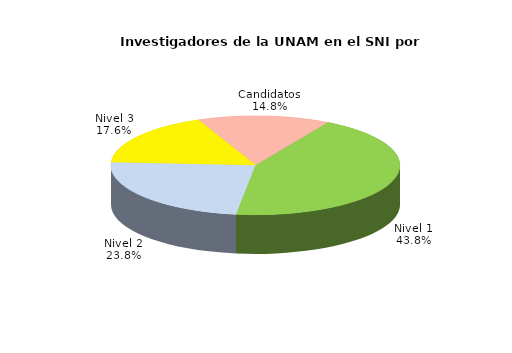
| Category | Series 0 |
|---|---|
| Nivel 1 | 2075 |
| Nivel 2 | 1128 |
| Nivel 3 | 831 |
| Candidatos | 702 |